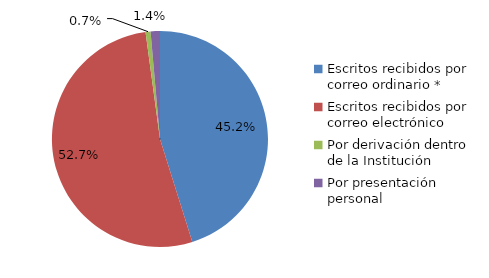
| Category | Series 0 |
|---|---|
| Escritos recibidos por correo ordinario * | 485 |
| Escritos recibidos por correo electrónico | 566 |
| Por derivación dentro de la Institución | 8 |
| Por presentación personal | 15 |